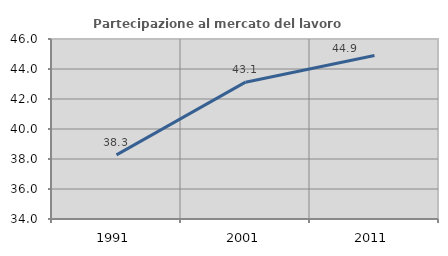
| Category | Partecipazione al mercato del lavoro  femminile |
|---|---|
| 1991.0 | 38.276 |
| 2001.0 | 43.123 |
| 2011.0 | 44.898 |